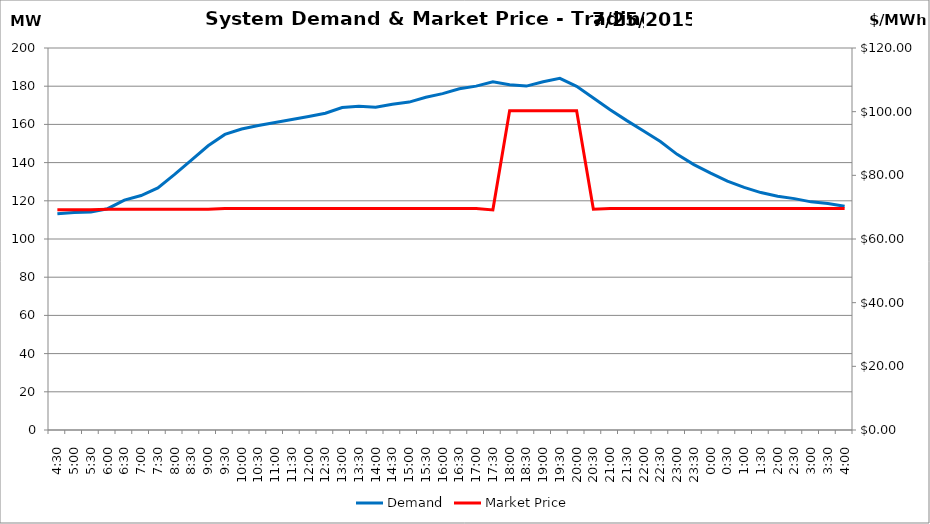
| Category | Demand |
|---|---|
| 0.1875 | 113.17 |
| 0.20833333333333334 | 113.92 |
| 0.22916666666666666 | 114.15 |
| 0.25 | 115.86 |
| 0.270833333333333 | 120.38 |
| 0.291666666666667 | 122.76 |
| 0.3125 | 126.75 |
| 0.333333333333333 | 133.83 |
| 0.354166666666667 | 141.35 |
| 0.375 | 148.83 |
| 0.395833333333333 | 154.74 |
| 0.416666666666667 | 157.6 |
| 0.4375 | 159.46 |
| 0.458333333333333 | 161.04 |
| 0.479166666666667 | 162.58 |
| 0.5 | 164.12 |
| 0.520833333333333 | 165.84 |
| 0.541666666666667 | 168.85 |
| 0.5625 | 169.44 |
| 0.583333333333333 | 168.98 |
| 0.604166666666667 | 170.53 |
| 0.625 | 171.68 |
| 0.645833333333334 | 174.21 |
| 0.666666666666667 | 176.1 |
| 0.6875 | 178.62 |
| 0.708333333333334 | 180.04 |
| 0.729166666666667 | 182.35 |
| 0.75 | 180.78 |
| 0.770833333333334 | 180.05 |
| 0.791666666666667 | 182.36 |
| 0.8125 | 184.11 |
| 0.833333333333334 | 179.95 |
| 0.854166666666667 | 173.87 |
| 0.875 | 167.7 |
| 0.895833333333334 | 161.98 |
| 0.916666666666667 | 156.56 |
| 0.9375 | 151.08 |
| 0.958333333333334 | 144.32 |
| 0.979166666666667 | 138.97 |
| 1900-01-01 | 134.53 |
| 1900-01-01 00:30:00 | 130.34 |
| 1900-01-01 01:00:00 | 126.99 |
| 1900-01-01 01:30:00 | 124.31 |
| 1900-01-01 02:00:00 | 122.36 |
| 1900-01-01 02:30:00 | 121.14 |
| 1900-01-01 03:00:00 | 119.45 |
| 1900-01-01 03:30:00 | 118.56 |
| 1900-01-01 04:00:00 | 117.13 |